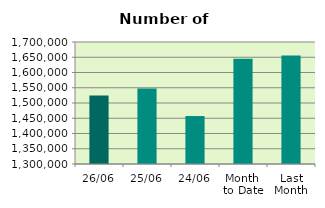
| Category | Series 0 |
|---|---|
| 26/06 | 1524598 |
| 25/06 | 1547608 |
| 24/06 | 1457252 |
| Month 
to Date | 1645474.111 |
| Last
Month | 1656073.545 |